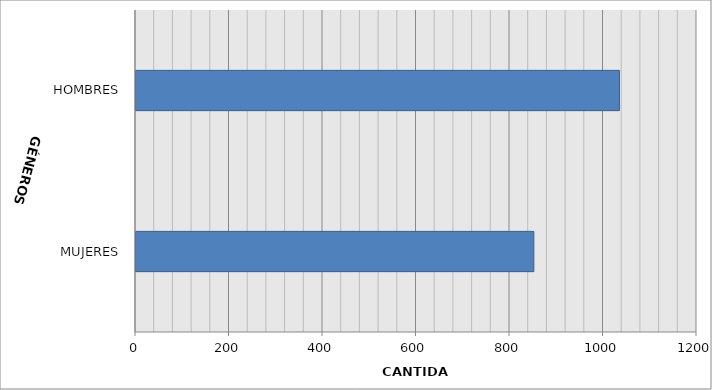
| Category | Series 0 |
|---|---|
| MUJERES | 851 |
| HOMBRES | 1034 |